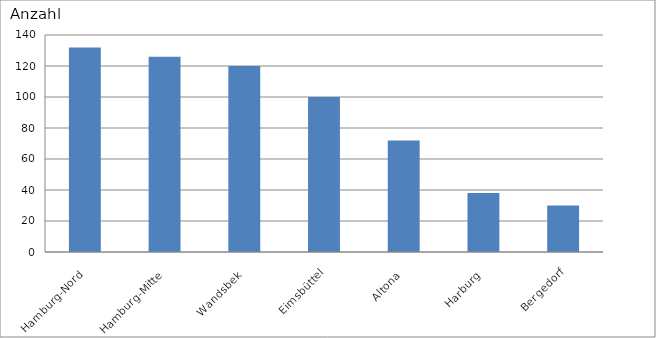
| Category | Hamburg-Nord |
|---|---|
| Hamburg-Nord | 132 |
| Hamburg-Mitte | 126 |
| Wandsbek | 120 |
| Eimsbüttel | 100 |
| Altona | 72 |
| Harburg | 38 |
| Bergedorf | 30 |